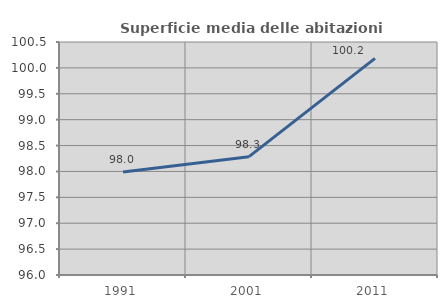
| Category | Superficie media delle abitazioni occupate |
|---|---|
| 1991.0 | 97.99 |
| 2001.0 | 98.285 |
| 2011.0 | 100.185 |